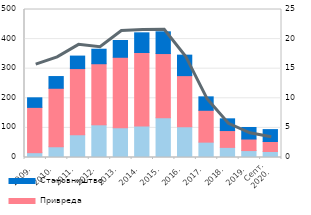
| Category | Остали сектори | Привреда | Становништво |
|---|---|---|---|
| 2009. | 16.3 | 153.043 | 32.3 |
| 2010. | 36.3 | 197.6 | 39.6 |
| 2011. | 77.1 | 223.3 | 42.2 |
| 2012. | 110.5 | 206.3 | 49 |
| 2013. | 100.2 | 238.4 | 56.7 |
| 2014. | 106.4 | 248.4 | 66.4 |
| 2015. | 134.4 | 216.8 | 73.4 |
| 2016. | 103.8 | 172.8 | 69.2 |
| 2017. | 51.9 | 107.6 | 45.4 |
| 2018. | 34.192 | 56.849 | 39.608 |
| 2019. | 23.45 | 38.949 | 39.017 |
| Септ.
2020. | 20.168 | 33.947 | 40.133 |